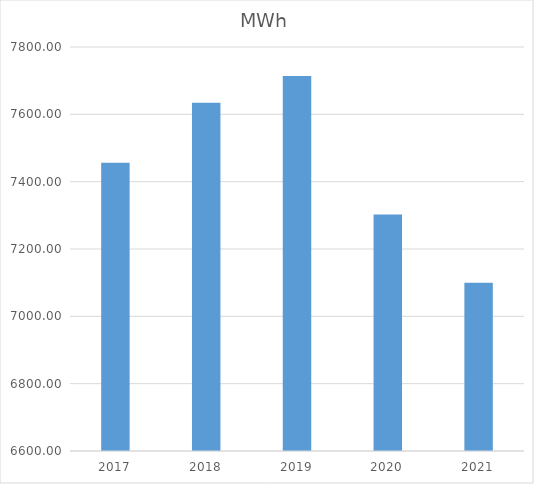
| Category | MWh |
|---|---|
| 2017.0 | 7456.556 |
| 2018.0 | 7634.424 |
| 2019.0 | 7713.739 |
| 2020.0 | 7302.407 |
| 2021.0 | 7099.922 |